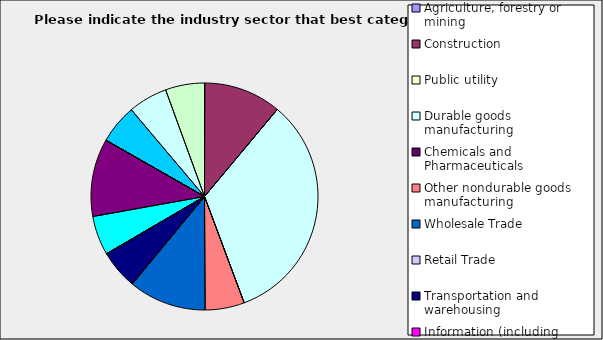
| Category | Series 0 |
|---|---|
| Agriculture, forestry or mining | 0 |
| Construction | 0.111 |
| Public utility | 0 |
| Durable goods manufacturing | 0.333 |
| Chemicals and Pharmaceuticals | 0 |
| Other nondurable goods manufacturing | 0.056 |
| Wholesale Trade | 0.111 |
| Retail Trade | 0 |
| Transportation and warehousing | 0.056 |
| Information (including broadcasting and telecommunication) | 0 |
| Finance and Insurance | 0 |
| Real Estate | 0.056 |
| Professional, scientific and technical services | 0.111 |
| Consulting | 0 |
| Administrative and office services (including waste management) | 0 |
| Education | 0 |
| Health Care and social services | 0.056 |
| Arts, entertainment and recreation | 0.056 |
| Accommodation and food services | 0.056 |
| Other | 0 |